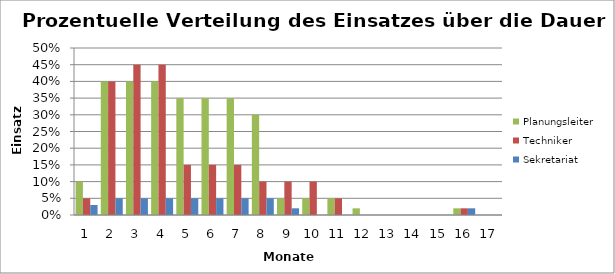
| Category | Planungsleiter | Techniker | Sekretariat |
|---|---|---|---|
| 0 | 0.1 | 0.05 | 0.03 |
| 1 | 0.4 | 0.4 | 0.05 |
| 2 | 0.4 | 0.45 | 0.05 |
| 3 | 0.4 | 0.45 | 0.05 |
| 4 | 0.35 | 0.15 | 0.05 |
| 5 | 0.35 | 0.15 | 0.05 |
| 6 | 0.35 | 0.15 | 0.05 |
| 7 | 0.3 | 0.1 | 0.05 |
| 8 | 0.05 | 0.1 | 0.02 |
| 9 | 0.05 | 0.1 | 0 |
| 10 | 0.05 | 0.05 | 0 |
| 11 | 0.02 | 0 | 0 |
| 12 | 0 | 0 | 0 |
| 13 | 0 | 0 | 0 |
| 14 | 0 | 0 | 0 |
| 15 | 0.02 | 0.02 | 0.02 |
| 16 | 0 | 0 | 0 |